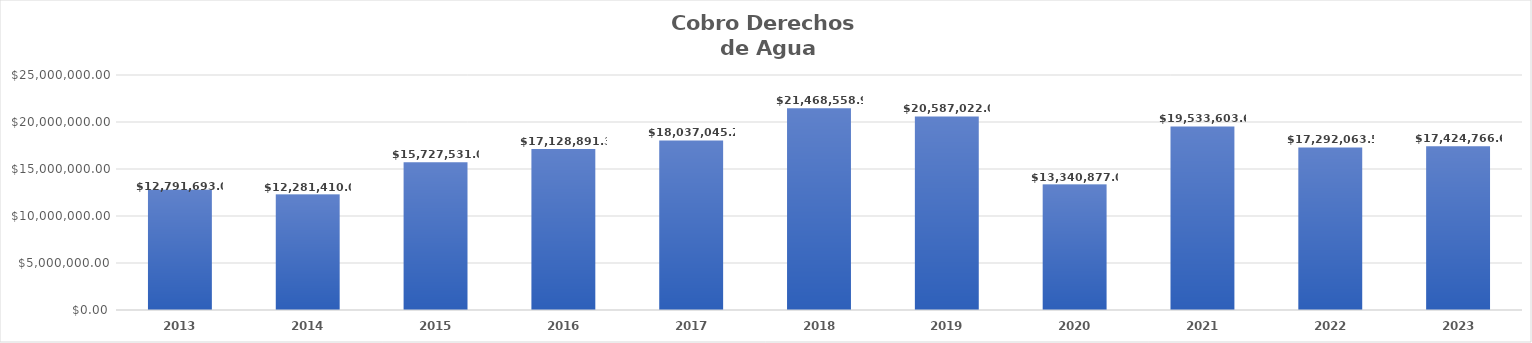
| Category | Cobro Derechos
 de Agua |
|---|---|
| 2013.0 | 12791693 |
| 2014.0 | 12281410 |
| 2015.0 | 15727531 |
| 2016.0 | 17128891.31 |
| 2017.0 | 18037045.24 |
| 2018.0 | 21468558.97 |
| 2019.0 | 20587022 |
| 2020.0 | 13340877 |
| 2021.0 | 19533603.68 |
| 2022.0 | 17292063.55 |
| 2023.0 | 17424766.63 |